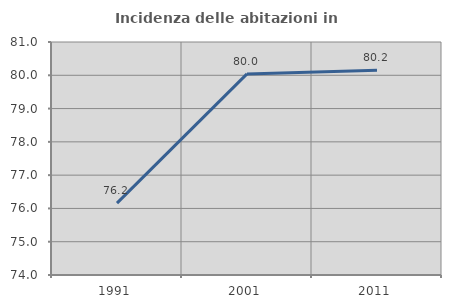
| Category | Incidenza delle abitazioni in proprietà  |
|---|---|
| 1991.0 | 76.16 |
| 2001.0 | 80.042 |
| 2011.0 | 80.153 |